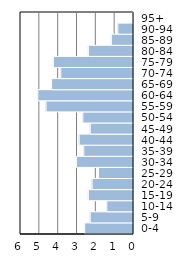
| Category | Series 0 |
|---|---|
| 0-4 | 2.59 |
| 5-9 | 2.297 |
| 10-14 | 1.417 |
| 15-19 | 2.395 |
| 20-24 | 2.199 |
| 25-29 | 1.857 |
| 30-34 | 3.03 |
| 35-39 | 2.639 |
| 40-44 | 2.884 |
| 45-49 | 2.297 |
| 50-54 | 2.688 |
| 55-59 | 4.643 |
| 60-64 | 5.083 |
| 65-69 | 4.35 |
| 70-74 | 3.861 |
| 75-79 | 4.252 |
| 80-84 | 2.395 |
| 85-89 | 1.173 |
| 90-94 | 0.831 |
| 95+ | 0.049 |